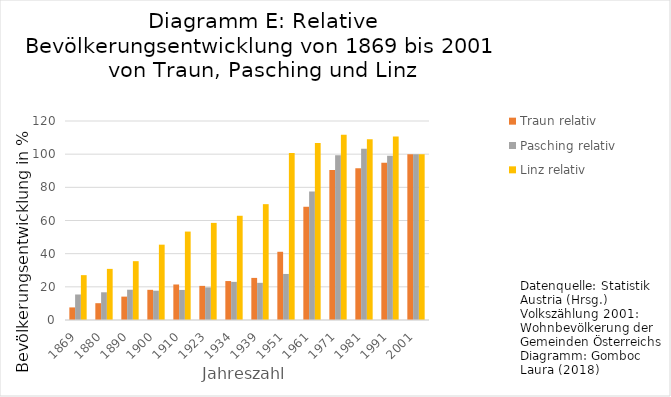
| Category | Traun relativ | Pasching relativ | Linz relativ |
|---|---|---|---|
| 1869.0 | 7.588 | 15.385 | 27.048 |
| 1880.0 | 10.132 | 16.707 | 30.827 |
| 1890.0 | 14.095 | 18.259 | 35.471 |
| 1900.0 | 18.198 | 17.671 | 45.425 |
| 1910.0 | 21.415 | 18.128 | 53.324 |
| 1923.0 | 20.579 | 19.647 | 58.562 |
| 1934.0 | 23.485 | 22.995 | 62.853 |
| 1939.0 | 25.386 | 22.407 | 69.85 |
| 1951.0 | 41.138 | 27.764 | 100.644 |
| 1961.0 | 68.283 | 77.544 | 106.798 |
| 1971.0 | 90.392 | 99.314 | 111.654 |
| 1981.0 | 91.453 | 103.299 | 108.94 |
| 1991.0 | 94.844 | 99.004 | 110.648 |
| 2001.0 | 100 | 100 | 100 |